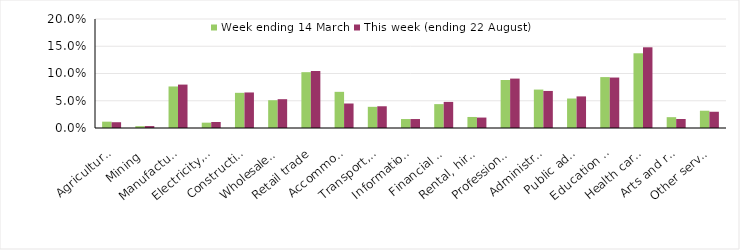
| Category | Week ending 14 March | This week (ending 22 August) |
|---|---|---|
| Agriculture, forestry and fishing | 0.012 | 0.011 |
| Mining | 0.003 | 0.004 |
| Manufacturing | 0.076 | 0.08 |
| Electricity, gas, water and waste services | 0.01 | 0.011 |
| Construction | 0.065 | 0.065 |
| Wholesale trade | 0.051 | 0.053 |
| Retail trade | 0.102 | 0.105 |
| Accommodation and food services | 0.066 | 0.045 |
| Transport, postal and warehousing | 0.039 | 0.04 |
| Information media and telecommunications | 0.016 | 0.016 |
| Financial and insurance services | 0.044 | 0.048 |
| Rental, hiring and real estate services | 0.02 | 0.019 |
| Professional, scientific and technical services | 0.088 | 0.091 |
| Administrative and support services | 0.071 | 0.068 |
| Public administration and safety | 0.054 | 0.058 |
| Education and training | 0.093 | 0.093 |
| Health care and social assistance | 0.137 | 0.148 |
| Arts and recreation services | 0.02 | 0.017 |
| Other services | 0.032 | 0.03 |